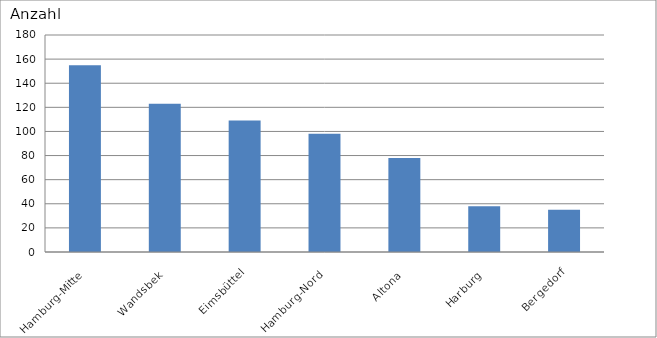
| Category | Hamburg-Mitte Wandsbek Eimsbüttel Hamburg-Nord Altona Harburg Bergedorf |
|---|---|
| Hamburg-Mitte | 155 |
| Wandsbek | 123 |
| Eimsbüttel | 109 |
| Hamburg-Nord | 98 |
| Altona | 78 |
| Harburg | 38 |
| Bergedorf | 35 |